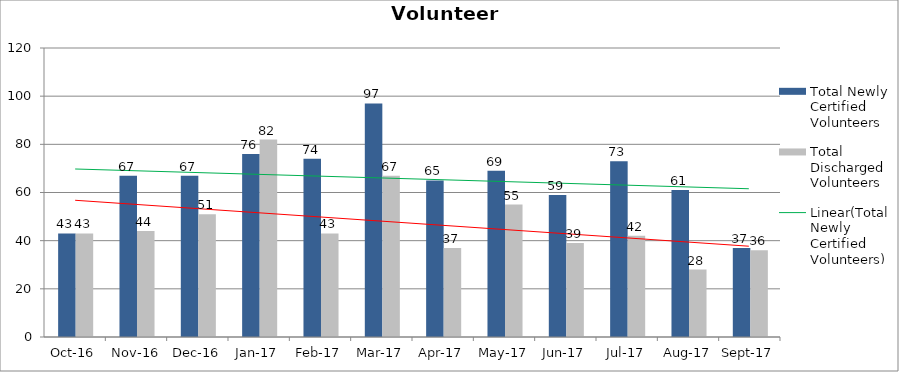
| Category | Total Newly Certified Volunteers | Total Discharged Volunteers |
|---|---|---|
| 2016-10-01 | 43 | 43 |
| 2016-11-01 | 67 | 44 |
| 2016-12-01 | 67 | 51 |
| 2017-01-01 | 76 | 82 |
| 2017-02-01 | 74 | 43 |
| 2017-03-01 | 97 | 67 |
| 2017-04-01 | 65 | 37 |
| 2017-05-01 | 69 | 55 |
| 2017-06-01 | 59 | 39 |
| 2017-07-01 | 73 | 42 |
| 2017-08-01 | 61 | 28 |
| 2017-09-01 | 37 | 36 |